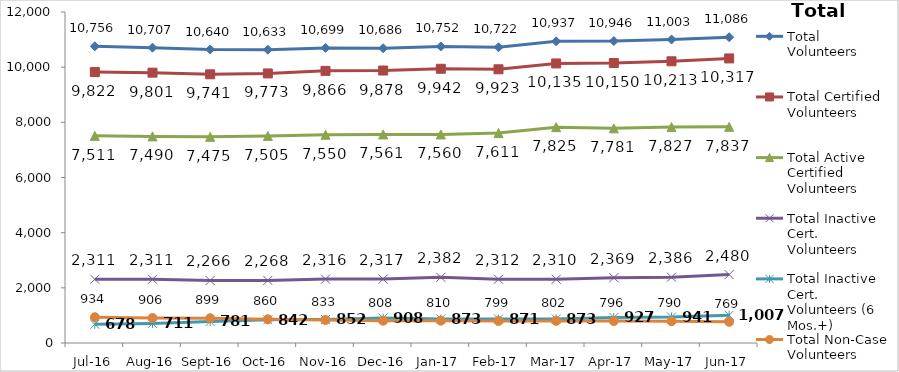
| Category | Total Volunteers | Total Certified Volunteers | Total Active Certified Volunteers | Total Inactive Cert. Volunteers | Total Inactive Cert. Volunteers (6 Mos.+) | Total Non-Case Volunteers |
|---|---|---|---|---|---|---|
| Jul-16 | 10756 | 9822 | 7511 | 2311 | 678 | 934 |
| Aug-16 | 10707 | 9801 | 7490 | 2311 | 711 | 906 |
| Sep-16 | 10640 | 9741 | 7475 | 2266 | 781 | 899 |
| Oct-16 | 10633 | 9773 | 7505 | 2268 | 842 | 860 |
| Nov-16 | 10699 | 9866 | 7550 | 2316 | 852 | 833 |
| Dec-16 | 10686 | 9878 | 7561 | 2317 | 908 | 808 |
| Jan-17 | 10752 | 9942 | 7560 | 2382 | 873 | 810 |
| Feb-17 | 10722 | 9923 | 7611 | 2312 | 871 | 799 |
| Mar-17 | 10937 | 10135 | 7825 | 2310 | 873 | 802 |
| Apr-17 | 10946 | 10150 | 7781 | 2369 | 927 | 796 |
| May-17 | 11003 | 10213 | 7827 | 2386 | 941 | 790 |
| Jun-17 | 11086 | 10317 | 7837 | 2480 | 1007 | 769 |